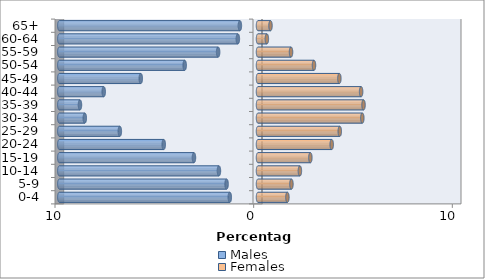
| Category | Males | Females |
|---|---|---|
| 0-4 | -1.419 | 1.48 |
| 5-9 | -1.582 | 1.683 |
| 10-14 | -1.967 | 2.109 |
| 15-19 | -3.224 | 2.636 |
| 20-24 | -4.745 | 3.71 |
| 25-29 | -6.955 | 4.116 |
| 30-34 | -8.719 | 5.251 |
| 35-39 | -8.962 | 5.312 |
| 40-44 | -7.766 | 5.191 |
| 45-49 | -5.9 | 4.096 |
| 50-54 | -3.69 | 2.818 |
| 55-59 | -2.007 | 1.663 |
| 60-64 | -1.014 | 0.446 |
| 65+ | -0.912 | 0.629 |